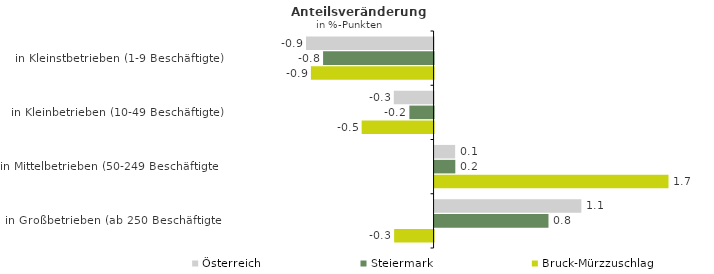
| Category | Österreich | Steiermark | Bruck-Mürzzuschlag |
|---|---|---|---|
| in Kleinstbetrieben (1-9 Beschäftigte) | -0.926 | -0.802 | -0.891 |
| in Kleinbetrieben (10-49 Beschäftigte) | -0.289 | -0.176 | -0.522 |
| in Mittelbetrieben (50-249 Beschäftigte) | 0.149 | 0.151 | 1.699 |
| in Großbetrieben (ab 250 Beschäftigte) | 1.066 | 0.827 | -0.286 |